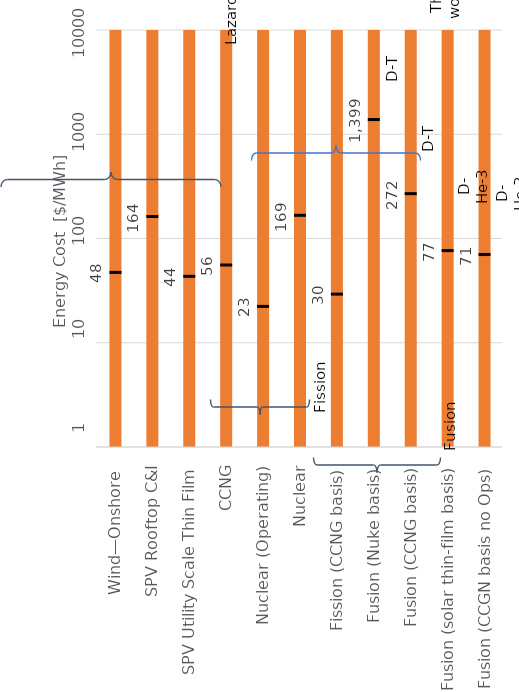
| Category | Average |
|---|---|
| Wind—Onshore  | 47.839 |
| SPV Rooftop C&I | 164.261 |
| SPV Utility Scale Thin Film | 43.868 |
| CCNG | 56.289 |
| Nuclear (Operating) | 22.572 |
| Nuclear | 168.845 |
| Fission (CCNG basis) | 29.605 |
| Fusion (Nuke basis) | 1398.712 |
| Fusion (CCNG basis) | 272.185 |
| Fusion (solar thin-film basis) | 77.398 |
| Fusion (CCGN basis no Ops) | 70.937 |